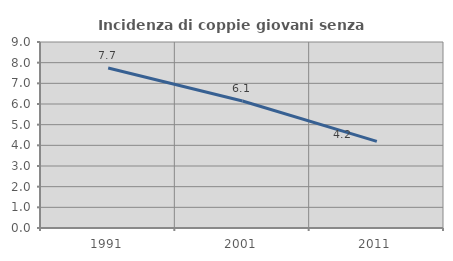
| Category | Incidenza di coppie giovani senza figli |
|---|---|
| 1991.0 | 7.741 |
| 2001.0 | 6.148 |
| 2011.0 | 4.193 |